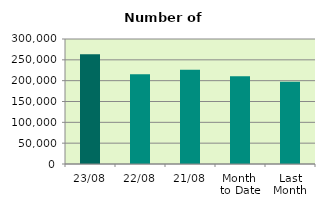
| Category | Series 0 |
|---|---|
| 23/08 | 263614 |
| 22/08 | 215298 |
| 21/08 | 226274 |
| Month 
to Date | 210372.941 |
| Last
Month | 197154 |